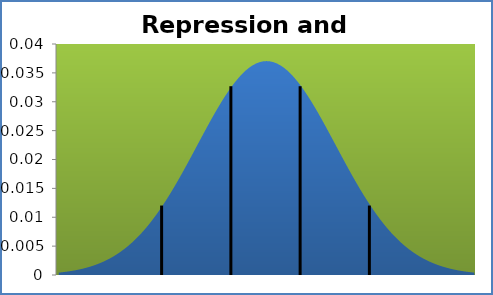
| Category | densité |
|---|---|
| -0.9999999999999964 | 0 |
| -0.46149999999999736 | 0 |
| 0.07700000000000173 | 0.001 |
| 0.6155000000000008 | 0.001 |
| 1.154 | 0.001 |
| 1.692499999999999 | 0.001 |
| 2.2310000000000016 | 0.001 |
| 2.7695000000000007 | 0.001 |
| 3.308 | 0.001 |
| 3.846499999999999 | 0.001 |
| 4.384999999999998 | 0.002 |
| 4.923499999999997 | 0.002 |
| 5.461999999999996 | 0.002 |
| 6.000499999999999 | 0.002 |
| 6.5390000000000015 | 0.003 |
| 7.077500000000001 | 0.003 |
| 7.616 | 0.003 |
| 8.154500000000002 | 0.004 |
| 8.693000000000001 | 0.004 |
| 9.2315 | 0.005 |
| 9.77 | 0.005 |
| 10.308499999999999 | 0.006 |
| 10.846999999999998 | 0.006 |
| 11.385499999999997 | 0.007 |
| 11.924 | 0.007 |
| 12.462499999999999 | 0.008 |
| 13.000999999999998 | 0.009 |
| 13.5395 | 0.009 |
| 14.078 | 0.01 |
| 14.616499999999998 | 0.011 |
| 15.155000000000001 | 0.012 |
| 15.6935 | 0.013 |
| 16.232 | 0.014 |
| 16.7705 | 0.015 |
| 17.308999999999997 | 0.016 |
| 17.847499999999997 | 0.017 |
| 18.385999999999996 | 0.018 |
| 18.924500000000002 | 0.019 |
| 19.463 | 0.02 |
| 20.0015 | 0.021 |
| 20.54 | 0.022 |
| 21.0785 | 0.024 |
| 21.616999999999997 | 0.025 |
| 22.155499999999996 | 0.026 |
| 22.694 | 0.027 |
| 23.2325 | 0.028 |
| 23.771 | 0.029 |
| 24.3095 | 0.03 |
| 24.848 | 0.031 |
| 25.386499999999998 | 0.032 |
| 25.924999999999997 | 0.033 |
| 26.4635 | 0.033 |
| 27.002 | 0.034 |
| 27.540499999999998 | 0.035 |
| 28.078999999999997 | 0.035 |
| 28.6175 | 0.036 |
| 29.156 | 0.036 |
| 29.694499999999998 | 0.037 |
| 30.232999999999997 | 0.037 |
| 30.7715 | 0.037 |
| 31.31 | 0.037 |
| 31.848499999999998 | 0.037 |
| 32.387 | 0.037 |
| 32.9255 | 0.037 |
| 33.464 | 0.036 |
| 34.0025 | 0.036 |
| 34.541 | 0.035 |
| 35.079499999999996 | 0.035 |
| 35.617999999999995 | 0.034 |
| 36.1565 | 0.033 |
| 36.695 | 0.033 |
| 37.2335 | 0.032 |
| 37.772 | 0.031 |
| 38.3105 | 0.03 |
| 38.849 | 0.029 |
| 39.387499999999996 | 0.028 |
| 39.926 | 0.027 |
| 40.4645 | 0.026 |
| 41.003 | 0.025 |
| 41.5415 | 0.024 |
| 42.08 | 0.022 |
| 42.6185 | 0.021 |
| 43.157 | 0.02 |
| 43.695499999999996 | 0.019 |
| 44.234 | 0.018 |
| 44.7725 | 0.017 |
| 45.311 | 0.016 |
| 45.8495 | 0.015 |
| 46.388 | 0.014 |
| 46.9265 | 0.013 |
| 47.464999999999996 | 0.012 |
| 48.0035 | 0.011 |
| 48.542 | 0.01 |
| 49.0805 | 0.009 |
| 49.619 | 0.009 |
| 50.1575 | 0.008 |
| 50.696 | 0.007 |
| 51.2345 | 0.007 |
| 51.772999999999996 | 0.006 |
| 52.311499999999995 | 0.006 |
| 52.849999999999994 | 0.005 |
| 53.38849999999999 | 0.005 |
| 53.92699999999999 | 0.004 |
| 54.46549999999999 | 0.004 |
| 55.004 | 0.003 |
| 55.5425 | 0.003 |
| 56.080999999999996 | 0.003 |
| 56.6195 | 0.002 |
| 57.158 | 0.002 |
| 57.6965 | 0.002 |
| 58.235 | 0.002 |
| 58.7735 | 0.001 |
| 59.312 | 0.001 |
| 59.8505 | 0.001 |
| 60.388999999999996 | 0.001 |
| 60.927499999999995 | 0.001 |
| 61.465999999999994 | 0.001 |
| 62.00449999999999 | 0.001 |
| 62.54299999999999 | 0.001 |
| 63.08149999999999 | 0 |
| 63.61999999999999 | 0 |